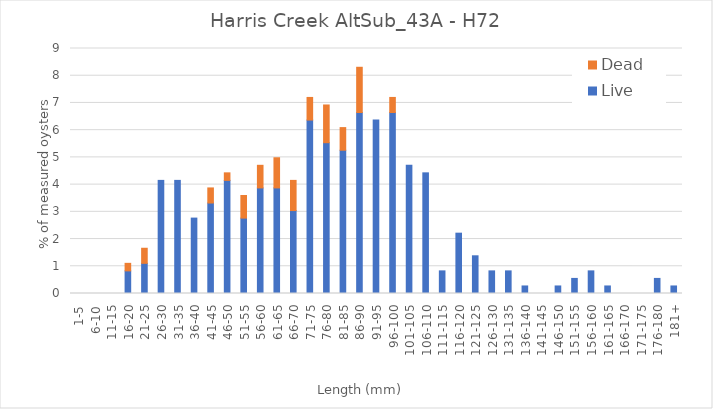
| Category | Live | Dead |
|---|---|---|
| 1-5 | 0 | 0 |
| 6-10 | 0 | 0 |
| 11-15 | 0 | 0 |
| 16-20 | 0.831 | 0.277 |
| 21-25 | 1.108 | 0.554 |
| 26-30 | 4.155 | 0 |
| 31-35 | 4.155 | 0 |
| 36-40 | 2.77 | 0 |
| 41-45 | 3.324 | 0.554 |
| 46-50 | 4.155 | 0.277 |
| 51-55 | 2.77 | 0.831 |
| 56-60 | 3.878 | 0.831 |
| 61-65 | 3.878 | 1.108 |
| 66-70 | 3.047 | 1.108 |
| 71-75 | 6.371 | 0.831 |
| 76-80 | 5.54 | 1.385 |
| 81-85 | 5.263 | 0.831 |
| 86-90 | 6.648 | 1.662 |
| 91-95 | 6.371 | 0 |
| 96-100 | 6.648 | 0.554 |
| 101-105 | 4.709 | 0 |
| 106-110 | 4.432 | 0 |
| 111-115 | 0.831 | 0 |
| 116-120 | 2.216 | 0 |
| 121-125 | 1.385 | 0 |
| 126-130 | 0.831 | 0 |
| 131-135 | 0.831 | 0 |
| 136-140 | 0.277 | 0 |
| 141-145 | 0 | 0 |
| 146-150 | 0.277 | 0 |
| 151-155 | 0.554 | 0 |
| 156-160 | 0.831 | 0 |
| 161-165 | 0.277 | 0 |
| 166-170 | 0 | 0 |
| 171-175 | 0 | 0 |
| 176-180 | 0.554 | 0 |
| 181+ | 0.277 | 0 |